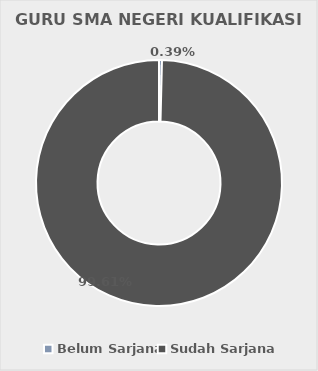
| Category | GURU SMA NEGERI KUALIFIKASI S1 |
|---|---|
| Belum Sarjana | 2 |
| Sudah Sarjana | 514 |